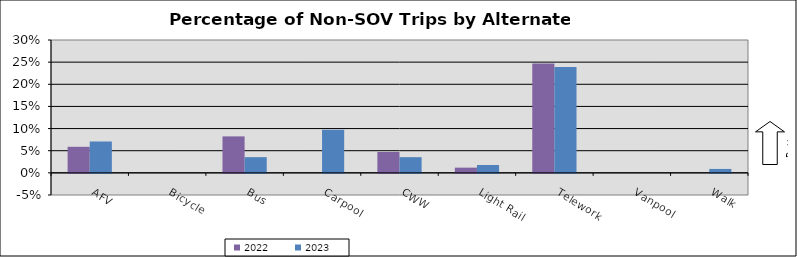
| Category | 2022 | 2023 |
|---|---|---|
| AFV | 0.059 | 0.071 |
| Bicycle | 0 | 0 |
| Bus | 0.082 | 0.035 |
| Carpool | 0 | 0.097 |
| CWW | 0.047 | 0.035 |
| Light Rail | 0.012 | 0.018 |
| Telework | 0.247 | 0.239 |
| Vanpool | 0 | 0 |
| Walk | 0 | 0.009 |